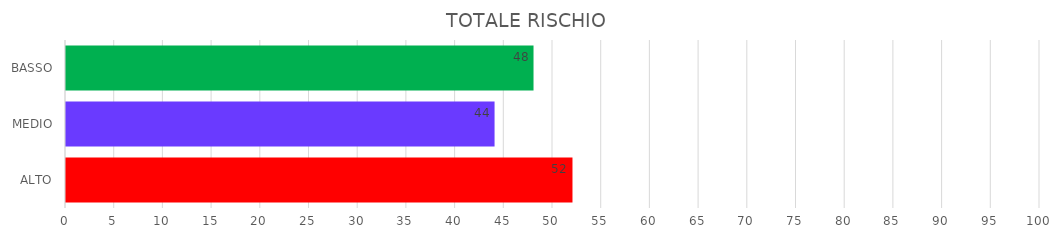
| Category | Series 1 | Series 0 |
|---|---|---|
| ALTO | 52 | 52 |
| MEDIO | 44 | 44 |
| BASSO | 48 | 48 |